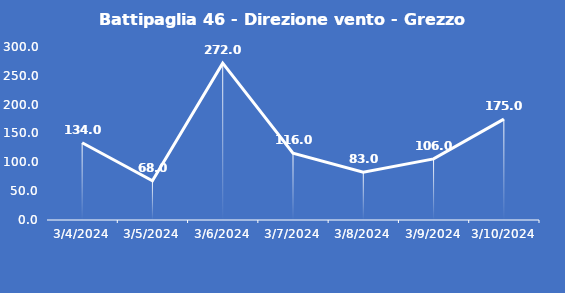
| Category | Battipaglia 46 - Direzione vento - Grezzo (°N) |
|---|---|
| 3/4/24 | 134 |
| 3/5/24 | 68 |
| 3/6/24 | 272 |
| 3/7/24 | 116 |
| 3/8/24 | 83 |
| 3/9/24 | 106 |
| 3/10/24 | 175 |